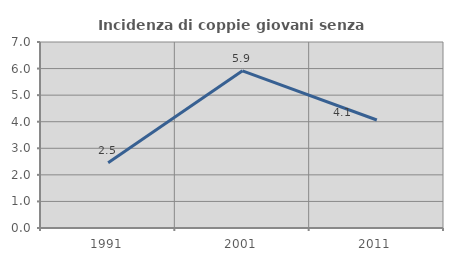
| Category | Incidenza di coppie giovani senza figli |
|---|---|
| 1991.0 | 2.459 |
| 2001.0 | 5.914 |
| 2011.0 | 4.065 |